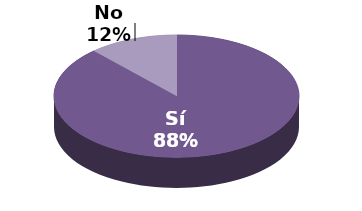
| Category | Series 1 |
|---|---|
| Sí | 30 |
| No | 4 |